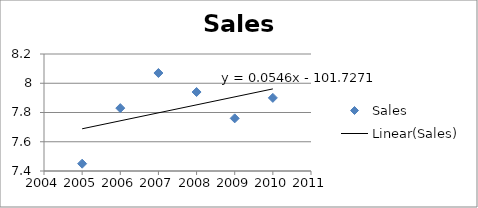
| Category | Sales |
|---|---|
| 2005.0 | 7.45 |
| 2006.0 | 7.83 |
| 2007.0 | 8.07 |
| 2008.0 | 7.94 |
| 2009.0 | 7.76 |
| 2010.0 | 7.9 |